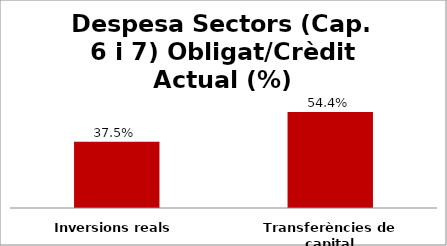
| Category | Series 0 |
|---|---|
| Inversions reals | 0.375 |
| Transferències de capital | 0.544 |